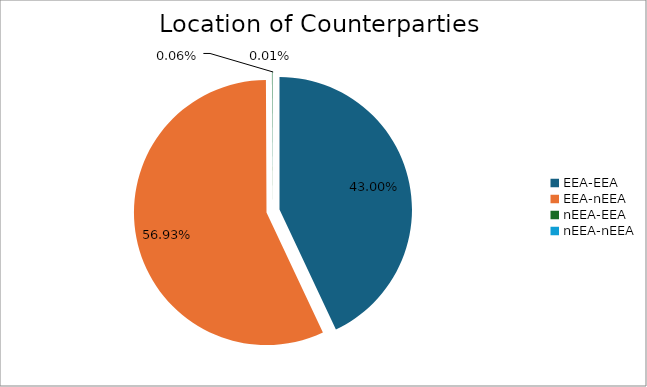
| Category | Series 0 |
|---|---|
| EEA-EEA | 5184898.655 |
| EEA-nEEA | 6864272.388 |
| nEEA-EEA | 7276.503 |
| nEEA-nEEA | 1188.652 |